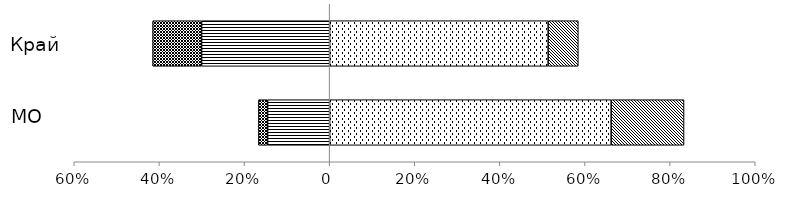
| Category | Пониженный | Недостаточный | Базовый | Повышенный |
|---|---|---|---|---|
|  | -0.146 | -0.022 | 0.661 | 0.171 |
|  | -0.301 | -0.115 | 0.513 | 0.071 |